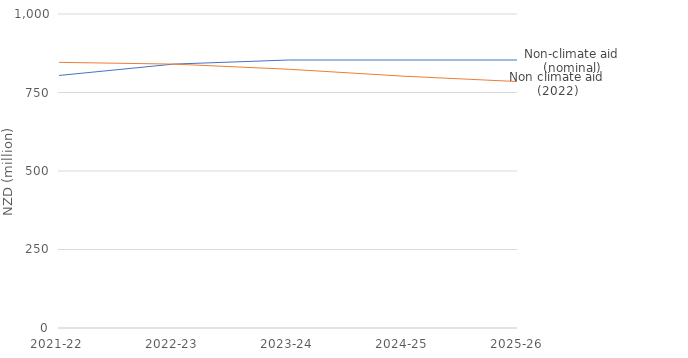
| Category | Non-climate aid (nominal) | Non climate aid (2022) |
|---|---|---|
| 2021-22 | 804.205 | 846.035 |
| 2022-23 | 840.431 | 840.431 |
| 2023-24 | 853.463 | 824.083 |
| 2024-25 | 853.463 | 802.048 |
| 2025-26 | 853.463 | 784.747 |